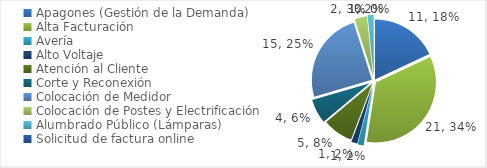
| Category | Series 0 |
|---|---|
| Apagones (Gestión de la Demanda) | 11 |
| Alta Facturación | 21 |
| Avería | 1 |
| Alto Voltaje | 1 |
| Atención al Cliente | 5 |
| Corte y Reconexión  | 4 |
| Colocación de Medidor | 15 |
| Colocación de Postes y Electrificación  | 2 |
| Alumbrado Público (Lámparas) | 1 |
| Solicitud de factura online | 0 |